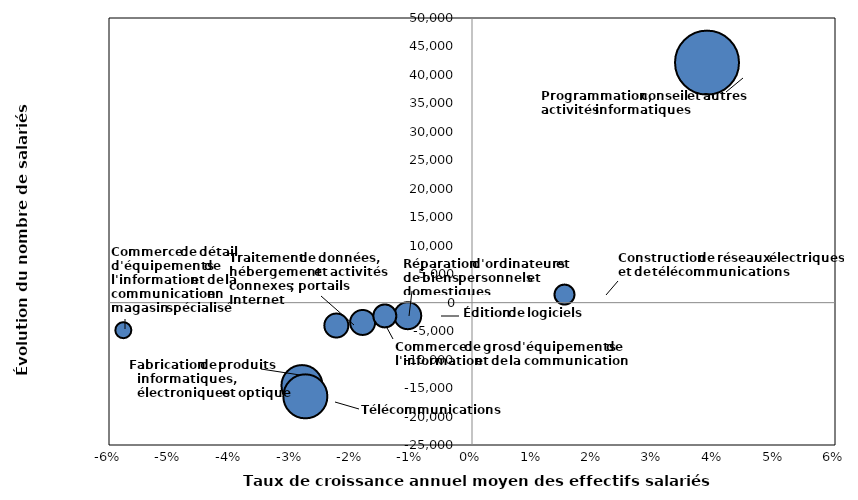
| Category | Series 0 |
|---|---|
| -0.0281590352901131 | -14500 |
| 0.015213492254397831 | 1500 |
| -0.018154368345229654 | -3400 |
| -0.057661806997322596 | -4800 |
| -0.010707138478276979 | -2200 |
| -0.0275978379853673 | -16400 |
| 0.03881201311245386 | 42200 |
| -0.022435791005062433 | -4000 |
| -0.014437424503332963 | -2300 |